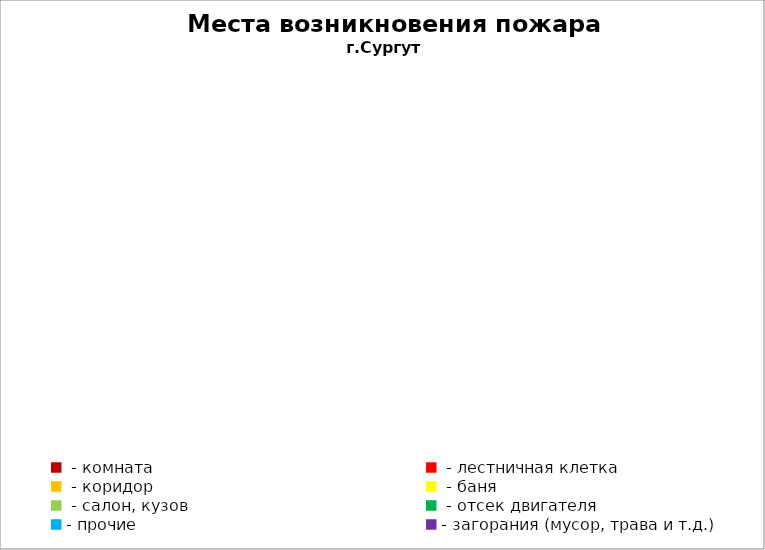
| Category | Места возникновения пожара |
|---|---|
|  - комната | 26 |
|  - лестничная клетка | 10 |
|  - коридор | 3 |
|  - баня | 10 |
|  - салон, кузов | 4 |
|  - отсек двигателя | 9 |
| - прочие | 28 |
| - загорания (мусор, трава и т.д.)  | 39 |